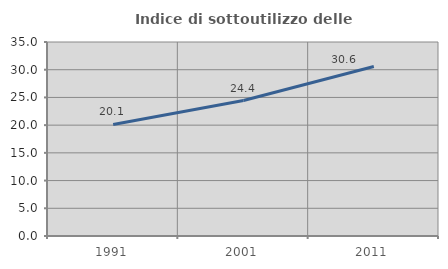
| Category | Indice di sottoutilizzo delle abitazioni  |
|---|---|
| 1991.0 | 20.125 |
| 2001.0 | 24.438 |
| 2011.0 | 30.586 |